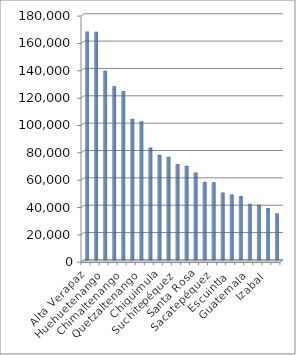
| Category | No. DE SACOS ENTREGADOS |
|---|---|
| Alta Verapaz | 166718 |
| San Marcos | 166598 |
| Huehuetenango | 138048 |
| Quiché | 126758 |
| Chimaltenango | 123294 |
| Sololá | 102912 |
| Quetzaltenango | 101048 |
| Jutiapa | 81952 |
| Chiquimula | 76594 |
| Baja Verapaz | 75210 |
| Suchitepéquez | 69774 |
| Totonicapán | 68584 |
| Santa Rosa | 63676 |
| Petén | 56832 |
| Sacatepéquez | 56478 |
| Jalapa | 49020 |
| Escuintla | 47624 |
| Retalhuleu | 46524 |
| Guatemala | 40814 |
| Zacapa | 40048 |
| Izabal | 37766 |
| El Progreso | 33804 |